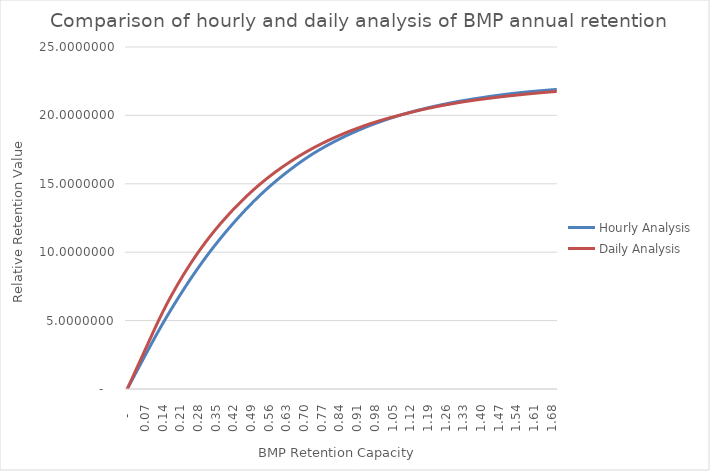
| Category | Hourly Analysis | Daily Analysis |
|---|---|---|
| 0.0 | 0 | 0 |
| 0.01 | 0.347 | 0.405 |
| 0.02 | 0.694 | 0.81 |
| 0.03 | 1.041 | 1.216 |
| 0.04 | 1.388 | 1.621 |
| 0.05 | 1.734 | 2.026 |
| 0.06 | 2.079 | 2.431 |
| 0.07 | 2.423 | 2.837 |
| 0.08 | 2.767 | 3.242 |
| 0.09 | 3.109 | 3.647 |
| 0.1 | 3.45 | 4.052 |
| 0.11 | 3.787 | 4.458 |
| 0.12 | 4.12 | 4.851 |
| 0.13 | 4.447 | 5.236 |
| 0.14 | 4.77 | 5.61 |
| 0.15 | 5.088 | 5.977 |
| 0.16 | 5.398 | 6.329 |
| 0.17 | 5.705 | 6.673 |
| 0.18 | 6.008 | 7.008 |
| 0.19 | 6.309 | 7.335 |
| 0.2 | 6.605 | 7.656 |
| 0.21 | 6.897 | 7.968 |
| 0.22 | 7.186 | 8.275 |
| 0.23 | 7.472 | 8.572 |
| 0.24 | 7.755 | 8.864 |
| 0.25 | 8.033 | 9.151 |
| 0.26 | 8.306 | 9.431 |
| 0.27 | 8.574 | 9.703 |
| 0.28 | 8.837 | 9.97 |
| 0.29 | 9.097 | 10.229 |
| 0.3 | 9.353 | 10.484 |
| 0.31 | 9.606 | 10.732 |
| 0.32 | 9.855 | 10.976 |
| 0.33 | 10.098 | 11.213 |
| 0.34 | 10.337 | 11.444 |
| 0.35 | 10.573 | 11.671 |
| 0.36 | 10.805 | 11.891 |
| 0.37 | 11.033 | 12.107 |
| 0.38 | 11.258 | 12.318 |
| 0.39 | 11.48 | 12.527 |
| 0.4 | 11.698 | 12.731 |
| 0.41 | 11.912 | 12.931 |
| 0.42 | 12.123 | 13.127 |
| 0.43 | 12.331 | 13.319 |
| 0.44 | 12.537 | 13.507 |
| 0.45 | 12.74 | 13.692 |
| 0.46 | 12.94 | 13.874 |
| 0.47 | 13.135 | 14.051 |
| 0.48 | 13.327 | 14.226 |
| 0.49 | 13.517 | 14.397 |
| 0.5 | 13.703 | 14.565 |
| 0.51 | 13.886 | 14.728 |
| 0.52 | 14.065 | 14.888 |
| 0.53 | 14.24 | 15.044 |
| 0.54 | 14.413 | 15.196 |
| 0.55 | 14.583 | 15.345 |
| 0.56 | 14.749 | 15.49 |
| 0.57 | 14.911 | 15.633 |
| 0.58 | 15.069 | 15.773 |
| 0.59 | 15.224 | 15.91 |
| 0.6 | 15.377 | 16.043 |
| 0.61 | 15.527 | 16.175 |
| 0.62 | 15.675 | 16.303 |
| 0.63 | 15.82 | 16.429 |
| 0.64 | 15.963 | 16.552 |
| 0.65 | 16.103 | 16.673 |
| 0.66 | 16.241 | 16.793 |
| 0.67 | 16.378 | 16.91 |
| 0.68 | 16.511 | 17.024 |
| 0.69 | 16.642 | 17.134 |
| 0.7 | 16.771 | 17.242 |
| 0.71 | 16.897 | 17.348 |
| 0.72 | 17.019 | 17.452 |
| 0.73 | 17.137 | 17.554 |
| 0.74 | 17.253 | 17.653 |
| 0.75 | 17.365 | 17.75 |
| 0.76 | 17.476 | 17.845 |
| 0.77 | 17.584 | 17.938 |
| 0.78 | 17.689 | 18.029 |
| 0.79 | 17.791 | 18.118 |
| 0.8 | 17.89 | 18.205 |
| 0.81 | 17.987 | 18.289 |
| 0.82 | 18.083 | 18.373 |
| 0.83 | 18.178 | 18.455 |
| 0.84 | 18.272 | 18.536 |
| 0.85 | 18.364 | 18.615 |
| 0.86 | 18.454 | 18.692 |
| 0.87 | 18.542 | 18.768 |
| 0.880000000000001 | 18.627 | 18.842 |
| 0.890000000000001 | 18.711 | 18.914 |
| 0.900000000000001 | 18.794 | 18.984 |
| 0.910000000000001 | 18.875 | 19.053 |
| 0.920000000000001 | 18.953 | 19.121 |
| 0.930000000000001 | 19.031 | 19.188 |
| 0.940000000000001 | 19.108 | 19.253 |
| 0.950000000000001 | 19.183 | 19.317 |
| 0.960000000000001 | 19.255 | 19.38 |
| 0.970000000000001 | 19.326 | 19.44 |
| 0.980000000000001 | 19.395 | 19.499 |
| 0.990000000000001 | 19.463 | 19.558 |
| 1.0 | 19.529 | 19.615 |
| 1.01 | 19.594 | 19.671 |
| 1.02 | 19.659 | 19.725 |
| 1.03 | 19.721 | 19.777 |
| 1.04 | 19.782 | 19.828 |
| 1.05 | 19.842 | 19.878 |
| 1.06 | 19.9 | 19.927 |
| 1.07 | 19.958 | 19.975 |
| 1.08 | 20.015 | 20.023 |
| 1.09 | 20.069 | 20.071 |
| 1.1 | 20.123 | 20.118 |
| 1.11 | 20.175 | 20.165 |
| 1.12 | 20.227 | 20.211 |
| 1.13 | 20.277 | 20.257 |
| 1.14 | 20.326 | 20.302 |
| 1.15 | 20.374 | 20.346 |
| 1.16 | 20.421 | 20.389 |
| 1.17 | 20.467 | 20.431 |
| 1.18 | 20.511 | 20.472 |
| 1.19 | 20.555 | 20.512 |
| 1.2 | 20.598 | 20.551 |
| 1.21 | 20.64 | 20.589 |
| 1.22 | 20.681 | 20.627 |
| 1.23 | 20.722 | 20.664 |
| 1.24 | 20.761 | 20.7 |
| 1.25 | 20.801 | 20.734 |
| 1.26 | 20.839 | 20.769 |
| 1.27 | 20.876 | 20.802 |
| 1.28 | 20.912 | 20.835 |
| 1.29 | 20.948 | 20.867 |
| 1.3 | 20.983 | 20.899 |
| 1.31 | 21.016 | 20.93 |
| 1.32 | 21.048 | 20.961 |
| 1.33 | 21.08 | 20.99 |
| 1.34 | 21.111 | 21.019 |
| 1.35 | 21.141 | 21.048 |
| 1.36 | 21.172 | 21.075 |
| 1.37 | 21.201 | 21.101 |
| 1.38 | 21.23 | 21.126 |
| 1.39 | 21.259 | 21.151 |
| 1.4 | 21.287 | 21.176 |
| 1.41 | 21.315 | 21.2 |
| 1.42 | 21.343 | 21.224 |
| 1.43 | 21.371 | 21.247 |
| 1.44 | 21.398 | 21.271 |
| 1.45 | 21.424 | 21.294 |
| 1.46 | 21.449 | 21.316 |
| 1.47 | 21.474 | 21.339 |
| 1.48 | 21.498 | 21.361 |
| 1.49 | 21.522 | 21.383 |
| 1.5 | 21.546 | 21.404 |
| 1.51 | 21.569 | 21.424 |
| 1.52 | 21.591 | 21.444 |
| 1.53 | 21.612 | 21.463 |
| 1.54 | 21.633 | 21.483 |
| 1.55 | 21.653 | 21.502 |
| 1.56 | 21.673 | 21.521 |
| 1.57 | 21.692 | 21.539 |
| 1.58 | 21.71 | 21.558 |
| 1.59 | 21.728 | 21.576 |
| 1.6 | 21.745 | 21.594 |
| 1.61 | 21.762 | 21.612 |
| 1.62 | 21.779 | 21.629 |
| 1.63 | 21.795 | 21.646 |
| 1.64 | 21.81 | 21.662 |
| 1.65 | 21.825 | 21.678 |
| 1.66 | 21.841 | 21.693 |
| 1.67 | 21.856 | 21.708 |
| 1.68 | 21.87 | 21.723 |
| 1.69 | 21.885 | 21.738 |
| 1.7 | 21.899 | 21.752 |